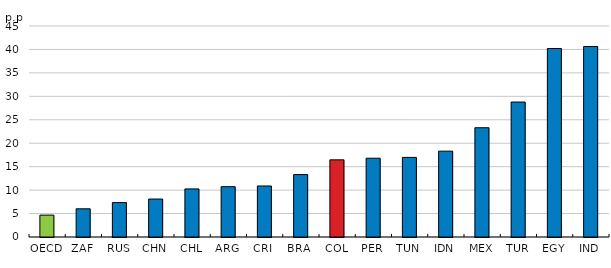
| Category | Series 0 |
|---|---|
| OECD | 4.664 |
| ZAF | 6.012 |
| RUS | 7.34 |
| CHN | 8.094 |
| CHL | 10.252 |
| ARG | 10.727 |
| CRI | 10.88 |
| BRA | 13.31 |
| COL | 16.453 |
| PER | 16.8 |
| TUN | 16.977 |
| IDN | 18.31 |
| MEX | 23.301 |
| TUR | 28.781 |
| EGY | 40.2 |
| IND | 40.625 |